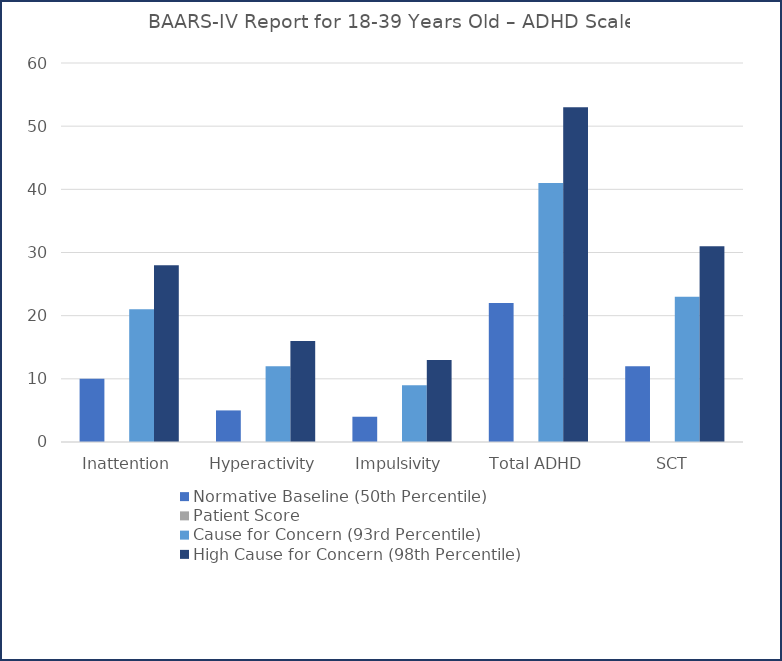
| Category | Normative Baseline (50th Percentile) | Patient Score | Cause for Concern (93rd Percentile) | High Cause for Concern (98th Percentile) |
|---|---|---|---|---|
| Inattention | 10 | 0 | 21 | 28 |
| Hyperactivity | 5 | 0 | 12 | 16 |
| Impulsivity | 4 | 0 | 9 | 13 |
| Total ADHD | 22 | 0 | 41 | 53 |
| SCT | 12 | 0 | 23 | 31 |